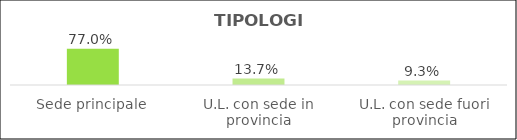
| Category | Series 0 |
|---|---|
| Sede principale | 0.77 |
| U.L. con sede in provincia | 0.137 |
| U.L. con sede fuori provincia | 0.093 |